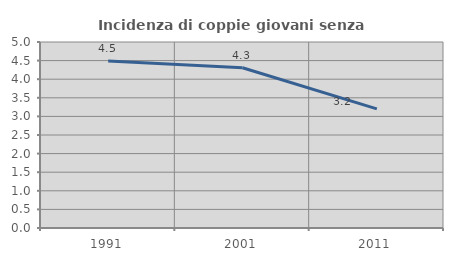
| Category | Incidenza di coppie giovani senza figli |
|---|---|
| 1991.0 | 4.488 |
| 2001.0 | 4.307 |
| 2011.0 | 3.202 |